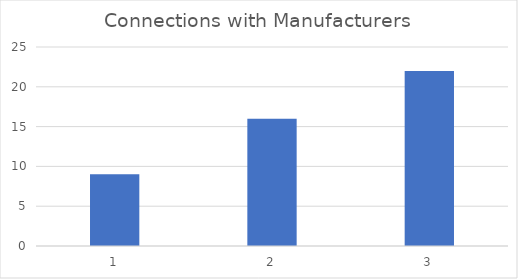
| Category | Connections with Manufacturers |
|---|---|
| 0 | 9 |
| 1 | 16 |
| 2 | 22 |